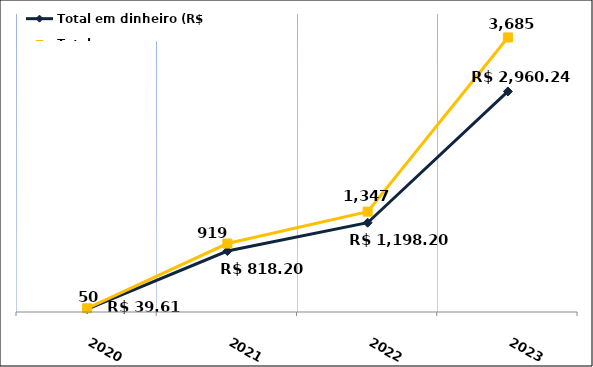
| Category | Total em dinheiro (R$) |
|---|---|
| 2020.0 | 39.61 |
| 2021.0 | 818.2 |
| 2022.0 | 1198.2 |
| 2023.0 | 2960.24 |